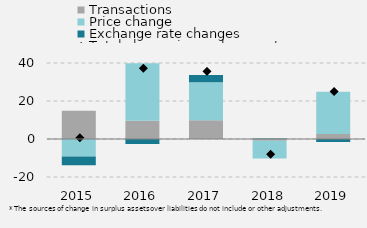
| Category | Transactions | Price change | Exchange rate changes |
|---|---|---|---|
| 2015.0 | 14923.821 | -9145.037 | -4674.338 |
| 2016.0 | 9625.93 | 30281.157 | -2617.608 |
| 2017.0 | 9848.845 | 19980.279 | 3895.718 |
| 2018.0 | -907 | -9325 | 257 |
| 2019.0 | 2567 | 22352 | -1582 |